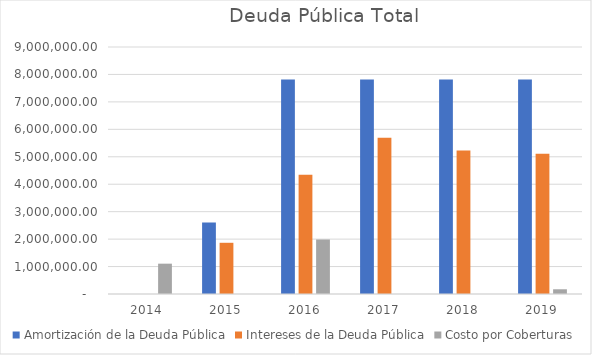
| Category | Amortización de la Deuda Pública | Intereses de la Deuda Pública | Costo por Coberturas |
|---|---|---|---|
| 2014.0 | 0 | 0 | 1105000 |
| 2015.0 | 2606060 | 1866105.74 | 0 |
| 2016.0 | 7818180 | 4345818.27 | 1986000 |
| 2017.0 | 7818180 | 5693878.46 | 0 |
| 2018.0 | 7818180 | 5229880.82 | 0 |
| 2019.0 | 7818180 | 5109542.92 | 172100 |